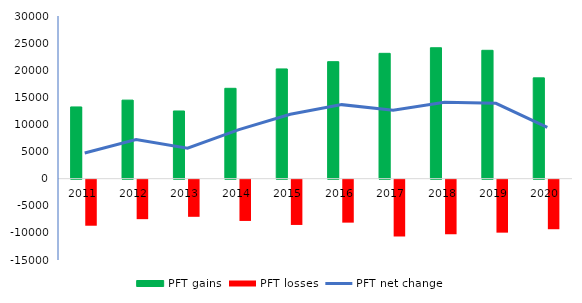
| Category | PFT gains | PFT losses |
|---|---|---|
| 2011.0 | 13230 | -8495 |
| 2012.0 | 14488 | -7283 |
| 2013.0 | 12485 | -6851 |
| 2014.0 | 16665 | -7613 |
| 2015.0 | 20240 | -8350 |
| 2016.0 | 21578 | -7925 |
| 2017.0 | 23113 | -10481 |
| 2018.0 | 24146 | -10067 |
| 2019.0 | 23674 | -9771 |
| 2020.0 | 18590 | -9140 |